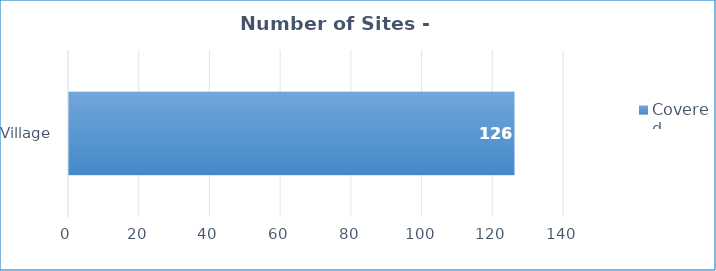
| Category | Covered |
|---|---|
| Village | 126 |